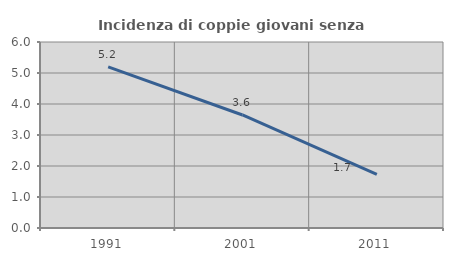
| Category | Incidenza di coppie giovani senza figli |
|---|---|
| 1991.0 | 5.2 |
| 2001.0 | 3.646 |
| 2011.0 | 1.733 |